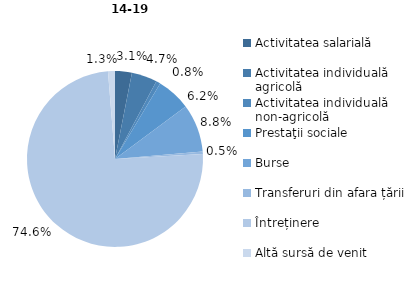
| Category | 14-19 ani | 30-34 ani |
|---|---|---|
| Activitatea salarială | 3.089 | 55.376 |
| Activitatea individuală agricolă | 4.702 | 9.031 |
| Activitatea individuală non-agricolă | 0.786 | 9.706 |
| Prestaţii sociale | 6.247 | 12.151 |
| Burse | 8.809 | 0 |
| Transferuri din afara țării | 0.481 | 8.187 |
| Întreținere | 74.612 | 4.276 |
| Altă sursă de venit | 1.275 | 1.274 |